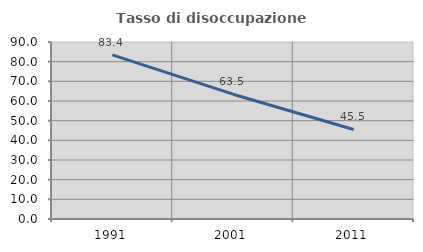
| Category | Tasso di disoccupazione giovanile  |
|---|---|
| 1991.0 | 83.449 |
| 2001.0 | 63.462 |
| 2011.0 | 45.536 |